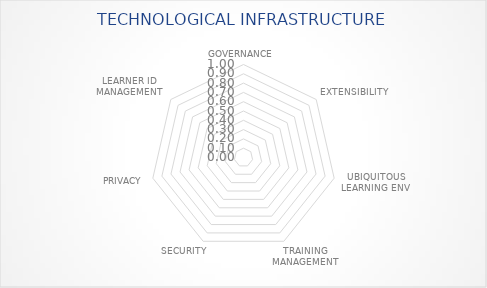
| Category | Series 0 |
|---|---|
| GOVERNANCE | 0 |
| EXTENSIBILITY | 0 |
| UBIQUITOUS LEARNING ENV | 0 |
| TRAINING MANAGEMENT | 0 |
| SECURITY | 0 |
| PRIVACY | 0 |
| LEARNER ID MANAGEMENT | 0 |